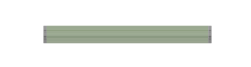
| Category | Deckel | Füllstand | Leer | Boden |
|---|---|---|---|---|
| 0 | 2 | 0 | 100 | 2 |